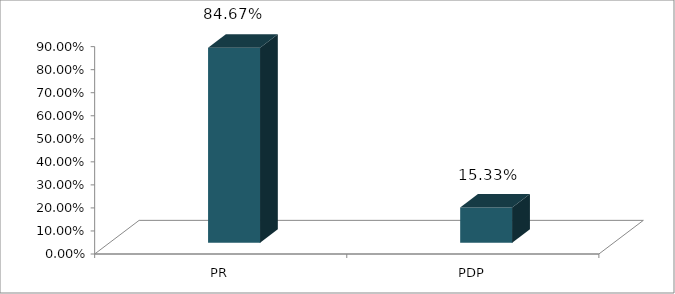
| Category | Votos % |
|---|---|
| PR | 0.847 |
| PDP | 0.153 |